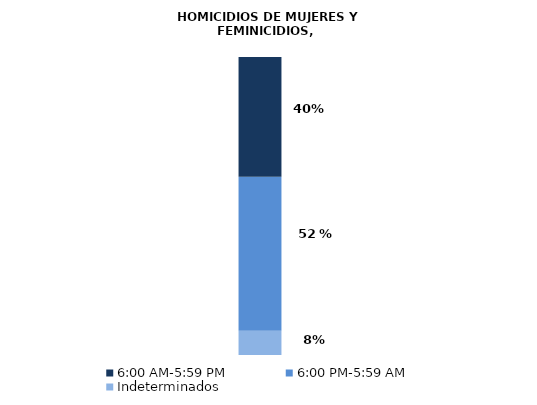
| Category | Indeterminados | 6:00 PM-5:59 AM | 6:00 AM-5:59 PM |
|---|---|---|---|
| 0 | 17 | 108 | 84 |